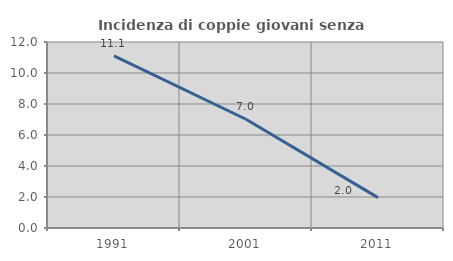
| Category | Incidenza di coppie giovani senza figli |
|---|---|
| 1991.0 | 11.111 |
| 2001.0 | 7.018 |
| 2011.0 | 1.961 |